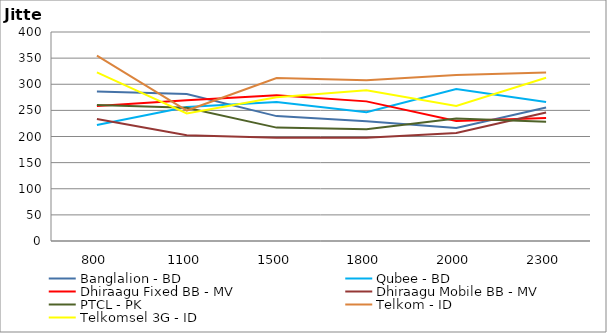
| Category | Banglalion - BD | Qubee - BD | Dhiraagu Fixed BB - MV | Dhiraagu Mobile BB - MV | PTCL - PK | Telkom - ID | Telkomsel 3G - ID |
|---|---|---|---|---|---|---|---|
| 800.0 | 286 | 222 | 258.308 | 233.385 | 260.167 | 354.833 | 322.833 |
| 1100.0 | 281.25 | 256.25 | 269.5 | 202.417 | 254.857 | 249.667 | 244 |
| 1500.0 | 239 | 266.25 | 278.923 | 197.769 | 217 | 311.8 | 275 |
| 1800.0 | 229.25 | 246.5 | 267.231 | 197.75 | 213.857 | 307.833 | 288.5 |
| 2000.0 | 216.25 | 291 | 229.75 | 206.538 | 234.333 | 317.833 | 258.4 |
| 2300.0 | 255.5 | 266 | 235.333 | 245.769 | 228.167 | 322.25 | 312.5 |